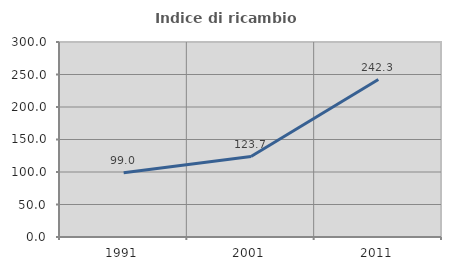
| Category | Indice di ricambio occupazionale  |
|---|---|
| 1991.0 | 98.974 |
| 2001.0 | 123.723 |
| 2011.0 | 242.25 |